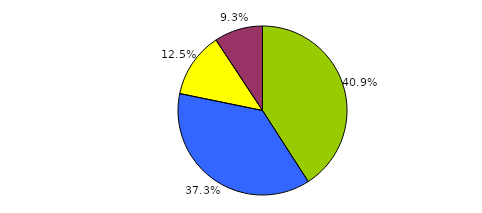
| Category | Series 0 |
|---|---|
| 0 | 458 |
| 1 | 418 |
| 2 | 140 |
| 3 | 104 |